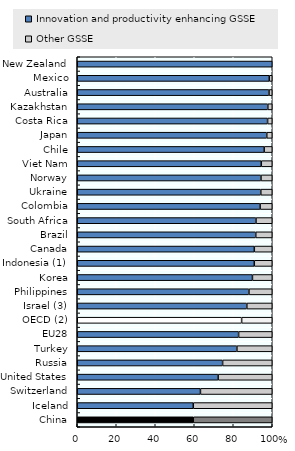
| Category | Innovation and productivity enhancing GSSE | Other GSSE |
|---|---|---|
| China | 59.499 | 40.501 |
| Iceland | 59.502 | 40.498 |
| Switzerland | 63.174 | 36.826 |
| United States | 72.259 | 27.741 |
| Russia | 74.546 | 25.454 |
| Turkey | 81.871 | 18.129 |
| EU28 | 82.749 | 17.251 |
| OECD (2) | 84.298 | 15.702 |
| Israel (3) | 86.969 | 13.031 |
| Philippines | 88.048 | 11.952 |
| Korea | 89.844 | 10.156 |
| Indonesia (1) | 90.79 | 9.21 |
| Canada | 90.808 | 9.192 |
| Brazil | 91.539 | 8.461 |
| South Africa | 91.659 | 8.341 |
| Colombia | 93.779 | 6.221 |
| Ukraine | 94.13 | 5.87 |
| Norway | 94.222 | 5.778 |
| Viet Nam | 94.376 | 5.624 |
| Chile | 95.862 | 4.138 |
| Japan | 97.191 | 2.809 |
| Costa Rica | 97.619 | 2.381 |
| Kazakhstan | 97.736 | 2.264 |
| Australia | 98.348 | 1.652 |
| Mexico | 98.48 | 1.52 |
| New Zealand | 100 | 0 |